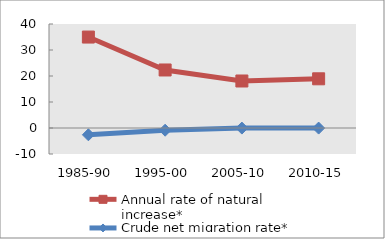
| Category | Annual rate of natural increase* | Crude net migration rate* |
|---|---|---|
| 1985-90 | 34.979 | -2.609 |
| 1995-00 | 22.314 | -0.85 |
| 2005-10 | 18.08 | -0.034 |
| 2010-15 | 18.922 | -0.031 |